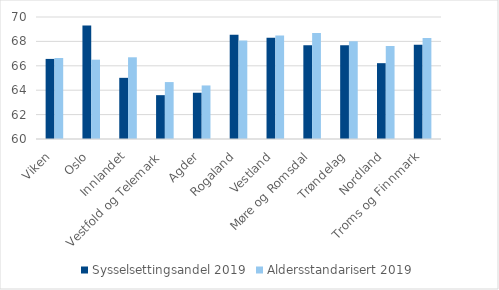
| Category | Sysselsettingsandel 2019 | Aldersstandarisert 2019 |
|---|---|---|
| Viken | 66.565 | 66.638 |
| Oslo | 69.295 | 66.502 |
| Innlandet | 65.014 | 66.697 |
| Vestfold og Telemark | 63.593 | 64.666 |
| Agder | 63.791 | 64.389 |
| Rogaland | 68.536 | 68.071 |
| Vestland | 68.293 | 68.48 |
| Møre og Romsdal | 67.682 | 68.684 |
| Trøndelag | 67.693 | 68.006 |
| Nordland | 66.216 | 67.613 |
| Troms og Finnmark | 67.725 | 68.269 |